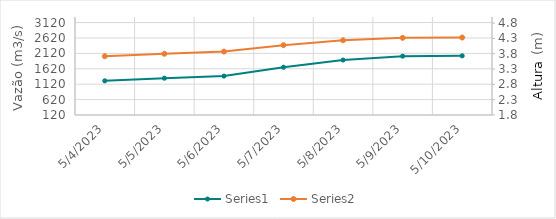
| Category | Series 0 |
|---|---|
| 5/10/23 | 1091.6 |
| 5/9/23 | 1134 |
| 5/8/23 | 1045.72 |
| 5/7/23 | 928.48 |
| 5/6/23 | 812.3 |
| 5/5/23 | 772.59 |
| 5/4/23 | 767.11 |